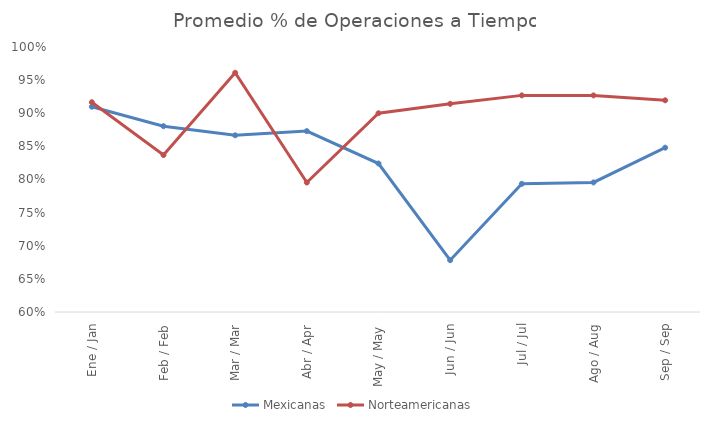
| Category | Mexicanas | Norteamericanas |
|---|---|---|
| Ene / Jan | 0.91 | 0.917 |
| Feb / Feb | 0.88 | 0.837 |
| Mar / Mar | 0.867 | 0.961 |
| Abr / Apr | 0.873 | 0.795 |
| May / May | 0.824 | 0.9 |
| Jun / Jun | 0.678 | 0.914 |
| Jul / Jul | 0.793 | 0.927 |
| Ago / Aug | 0.796 | 0.927 |
| Sep / Sep | 0.848 | 0.92 |